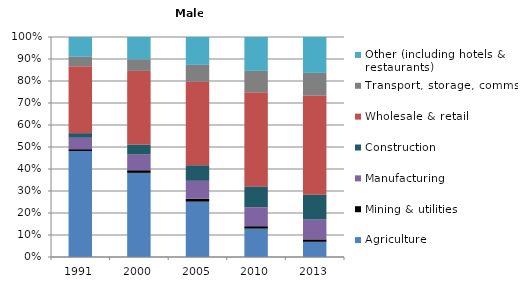
| Category | Agriculture | Mining & utilities  | Manufacturing | Construction | Wholesale & retail | Transport, storage, comms | Other (including hotels & restaurants) |
|---|---|---|---|---|---|---|---|
| 1991.0 | 48.2 | 0.8 | 5.2 | 2.1 | 30.4 | 4.3 | 9 |
| 2000.0 | 38.2 | 1.2 | 7.1 | 4.6 | 33.4 | 5.3 | 10.1 |
| 2005.0 | 25.2 | 1.3 | 8.2 | 7.1 | 38 | 7.7 | 12.7 |
| 2010.0 | 12.9 | 1.1 | 8.6 | 9.5 | 42.8 | 9.7 | 15.4 |
| 2013.0 | 6.9 | 1.1 | 9 | 11.3 | 45 | 10.3 | 16.3 |